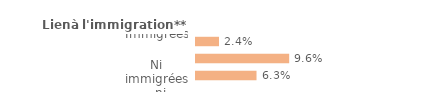
| Category | Series 0 |
|---|---|
| Immigrées | 0.024 |
| Descendantes d'immigré(s) | 0.096 |
| Ni immigrées, ni descendantes | 0.063 |